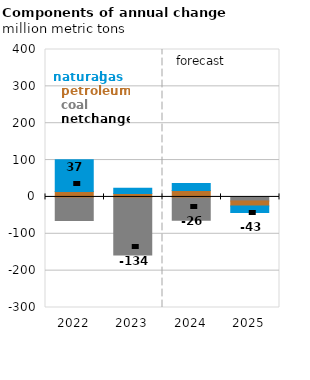
| Category | Coal | Petroleum | Natural gas |
|---|---|---|---|
| 2022.0 | -64.001 | 14.641 | 86.024 |
| 2023.0 | -157.552 | 9.615 | 13.648 |
| 2024.0 | -63.058 | 17.594 | 19.162 |
| 2025.0 | -10.967 | -13.418 | -18.118 |